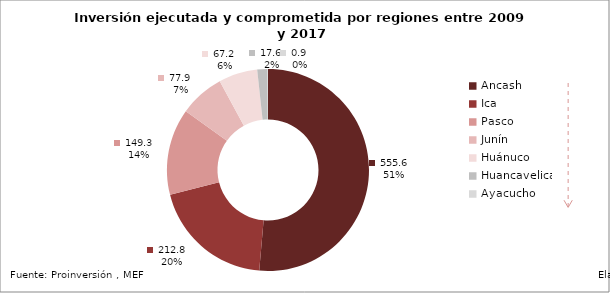
| Category | Series 0 |
|---|---|
| Áncash | 555.612 |
| Ica | 212.805 |
| Pasco | 149.278 |
| Junín | 77.911 |
| Huánuco | 67.177 |
| Huancavelica | 17.605 |
| Ayacucho | 0.882 |